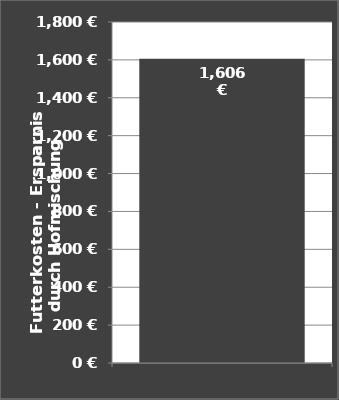
| Category | Differenz zur Hofmischung |
|---|---|
|  | 1606 |